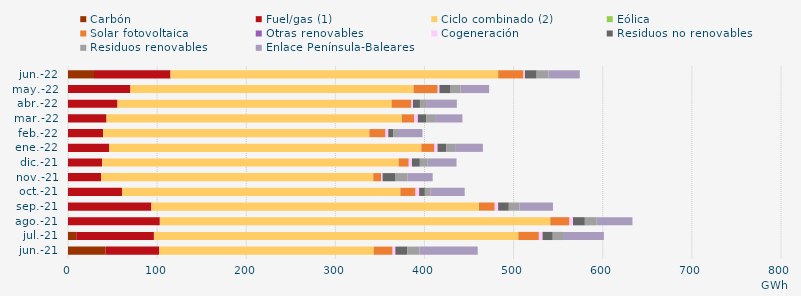
| Category | Carbón | Fuel/gas (1) | Ciclo combinado (2) | Eólica | Solar fotovoltaica | Otras renovables | Cogeneración | Residuos no renovables | Residuos renovables | Enlace Península-Baleares |
|---|---|---|---|---|---|---|---|---|---|---|
| jun.-21 | 41.953 | 60.343 | 240.581 | 0.094 | 21.17 | 0.1 | 3.062 | 13.482 | 13.482 | 65.429 |
| jul.-21 | 9.293 | 87.1 | 408.794 | 0.106 | 22.966 | 0.096 | 4.086 | 11.473 | 11.473 | 45.879 |
| ago.-21 | -0.729 | 103.041 | 437.914 | 0.201 | 21.415 | 0.084 | 3.931 | 13.32 | 13.32 | 40.107 |
| sep.-21 | -0.55 | 93.586 | 367.241 | 0.274 | 17.622 | 0.081 | 3.819 | 11.973 | 11.973 | 37.549 |
| oct.-21 | -0.583 | 60.568 | 312.103 | 0.27 | 16.793 | 0.243 | 4.021 | 6.415 | 6.415 | 38.286 |
| nov.-21 | -0.582 | 37.046 | 305.438 | 0.061 | 8.81 | 0.24 | 1.412 | 13.868 | 13.868 | 28.436 |
| dic.-21 | -0.614 | 38.331 | 332.591 | 0.101 | 11.149 | 0.23 | 3.519 | 8.866 | 8.866 | 32.271 |
| ene.-22 | -0.627 | 46.217 | 350.083 | 0.216 | 14.423 | 0.285 | 3.401 | 9.871 | 9.871 | 31.159 |
| feb.-22 | -0.58 | 39.301 | 298.623 | 0.228 | 17.844 | 0.281 | 3.068 | 5.441 | 5.441 | 27.503 |
| mar.-22 | -0.669 | 43.218 | 331.001 | 0.338 | 13.693 | 0.291 | 3.993 | 9.663 | 9.663 | 30.689 |
| abr.-22 | -0.605 | 55.507 | 307.429 | 0.24 | 21.88 | 0.165 | 1.839 | 7.805 | 7.805 | 33.641 |
| may.-22 | -1.03 | 70.043 | 317.556 | 0.161 | 26.907 | 0.166 | 1.946 | 11.846 | 11.846 | 32.047 |
| jun.-22 | 29.142 | 85.898 | 367.588 | 0.028 | 28.35 | 0.111 | 1.536 | 13.186 | 13.186 | 35.225 |